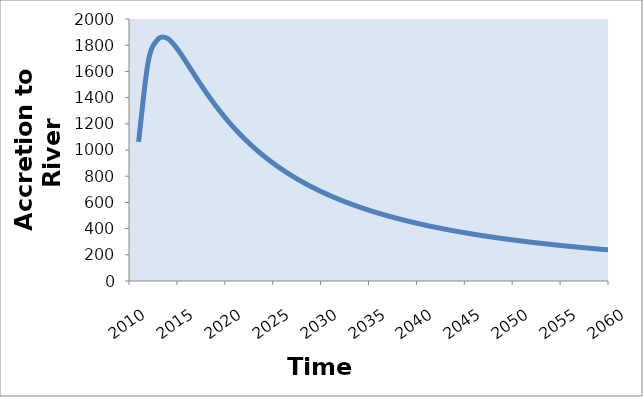
| Category | Returns to river |
|---|---|
| 2011.0 | 1061.528 |
| 2012.0 | 1671.776 |
| 2013.0 | 1843.386 |
| 2014.0 | 1852.331 |
| 2015.0 | 1775.5 |
| 2016.0 | 1667.834 |
| 2017.0 | 1554.214 |
| 2018.0 | 1444.718 |
| 2019.0 | 1343.037 |
| 2020.0 | 1250.151 |
| 2021.0 | 1165.902 |
| 2022.0 | 1089.68 |
| 2023.0 | 1020.728 |
| 2024.0 | 958.28 |
| 2025.0 | 901.613 |
| 2026.0 | 850.077 |
| 2027.0 | 803.091 |
| 2028.0 | 760.145 |
| 2029.0 | 720.794 |
| 2030.0 | 684.645 |
| 2031.0 | 651.36 |
| 2032.0 | 620.639 |
| 2033.0 | 592.221 |
| 2034.0 | 565.877 |
| 2035.0 | 541.406 |
| 2036.0 | 518.63 |
| 2037.0 | 497.391 |
| 2038.0 | 477.551 |
| 2039.0 | 458.984 |
| 2040.0 | 441.582 |
| 2041.0 | 425.245 |
| 2042.0 | 409.885 |
| 2043.0 | 395.424 |
| 2044.0 | 381.789 |
| 2045.0 | 368.917 |
| 2046.0 | 356.749 |
| 2047.0 | 345.234 |
| 2048.0 | 334.323 |
| 2049.0 | 323.974 |
| 2050.0 | 314.146 |
| 2051.0 | 304.805 |
| 2052.0 | 295.916 |
| 2053.0 | 287.451 |
| 2054.0 | 279.381 |
| 2055.0 | 271.682 |
| 2056.0 | 264.329 |
| 2057.0 | 257.302 |
| 2058.0 | 250.581 |
| 2059.0 | 244.148 |
| 2060.0 | 237.985 |